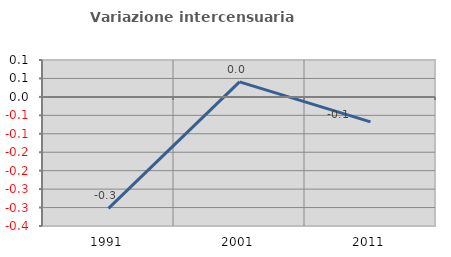
| Category | Variazione intercensuaria annua |
|---|---|
| 1991.0 | -0.302 |
| 2001.0 | 0.041 |
| 2011.0 | -0.068 |